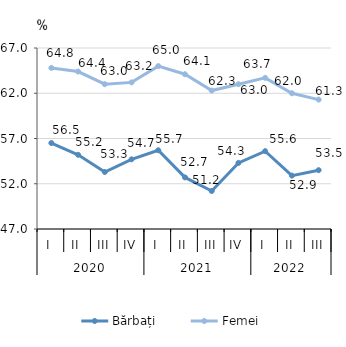
| Category | Bărbați | Femei |
|---|---|---|
| 0 | 56.5 | 64.8 |
| 1 | 55.2 | 64.4 |
| 2 | 53.3 | 63 |
| 3 | 54.7 | 63.2 |
| 4 | 55.7 | 65 |
| 5 | 52.7 | 64.1 |
| 6 | 51.2 | 62.3 |
| 7 | 54.3 | 63 |
| 8 | 55.6 | 63.7 |
| 9 | 52.9 | 62 |
| 10 | 53.5 | 61.3 |